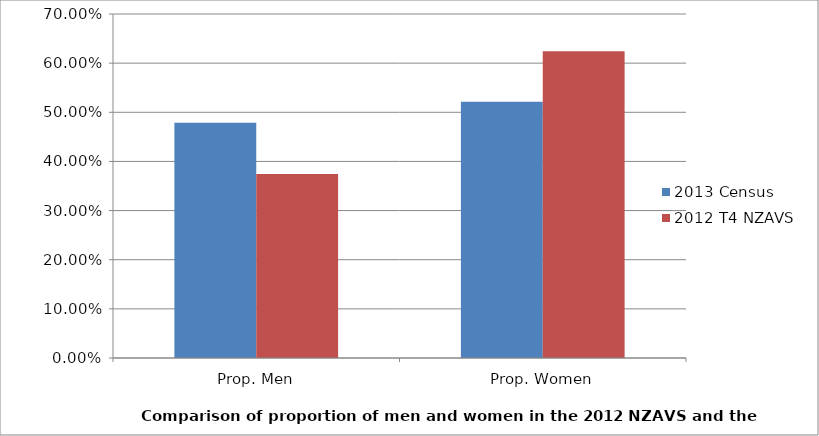
| Category | 2013 Census | 2012 T4 NZAVS |
|---|---|---|
| Prop. Men | 0.479 | 0.375 |
| Prop. Women | 0.521 | 0.624 |